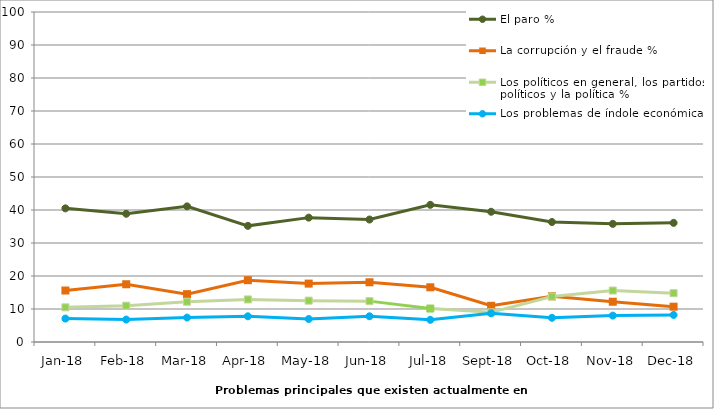
| Category | El paro | La corrupción y el fraude | Los políticos en general, los partidos políticos y la política | Los problemas de índole económica |
|---|---|---|---|---|
| 2018-01-01 | 1003 | 386 | 260 | 175 |
| 2018-02-01 | 966 | 436 | 273 | 169 |
| 2018-03-01 | 1014 | 358 | 301 | 183 |
| 2018-04-01 | 868 | 462 | 318 | 192 |
| 2018-05-01 | 935 | 439 | 311 | 173 |
| 2018-06-01 | 923 | 450 | 308 | 194 |
| 2018-07-01 | 1033 | 412 | 252 | 167 |
| 2018-09-01 | 1173 | 326 | 267 | 258 |
| 2018-10-01 | 1081 | 412 | 409 | 218 |
| 2018-11-01 | 1066 | 362 | 465 | 238 |
| 2018-12-01 | 1077 | 320 | 443 | 245 |